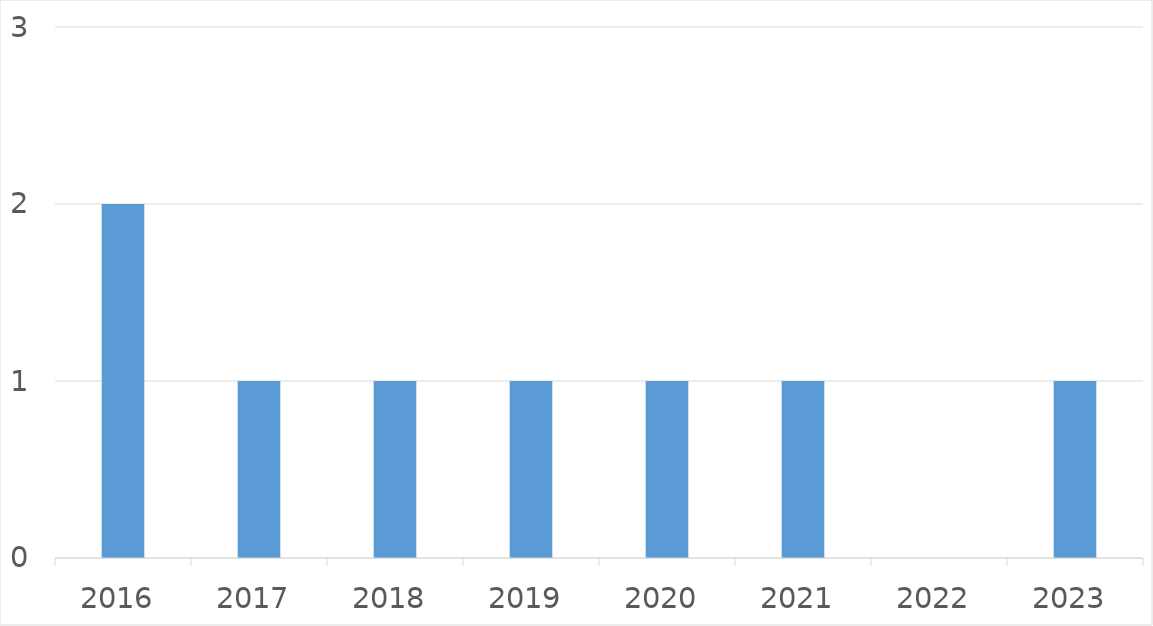
| Category | Series 0 |
|---|---|
| 2016 | 2 |
| 2017 | 1 |
| 2018 | 1 |
| 2019 | 1 |
| 2020 | 1 |
| 2021 | 1 |
| 2022 | 0 |
| 2023 | 1 |